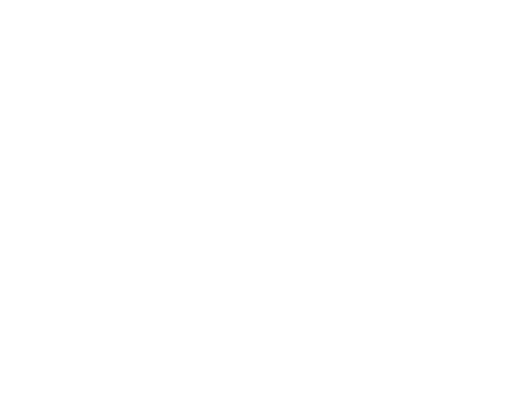
| Category | Series 0 | Series 1 | Series 2 |
|---|---|---|---|
| Impuestos | 286911591 | 0.187 |  |
| Cuotas y Aportaciones de Seguridad Social | 0 | 0 |  |
| Contribuciones de Mejoras | 27111444 | 0.018 |  |
| Derechos | 160251119 | 0.104 |  |
| Productos | 323242 | 0 |  |
| Aprovechamientos | 31634463 | 0.021 |  |
| Ingresos por Ventas de Bienes y Servicios | 0 | 0 |  |
| Participaciones y Aportaciones | 973152577 | 0.634 |  |
| Transferencias, Asignaciones, Subsidios y Otras Ayudas | 0 | 0 |  |
| Ingresos Derivados de Financiamientos | 55261128 | 0.036 |  |